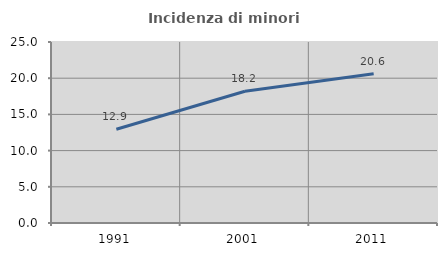
| Category | Incidenza di minori stranieri |
|---|---|
| 1991.0 | 12.941 |
| 2001.0 | 18.206 |
| 2011.0 | 20.614 |